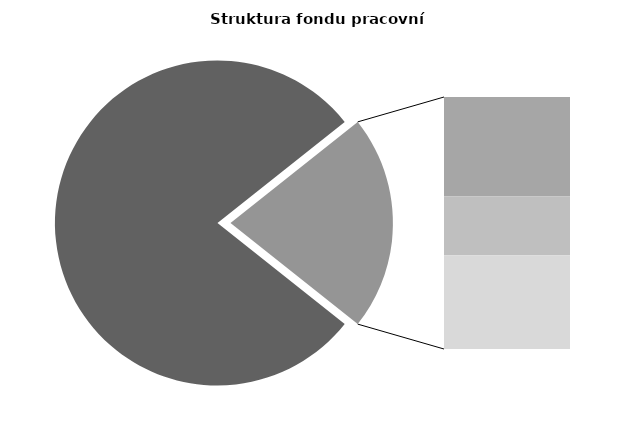
| Category | Series 0 |
|---|---|
| Průměrná měsíční odpracovaná doba bez přesčasu | 133.113 |
| Dovolená | 14.249 |
| Nemoc | 8.468 |
| Jiné | 13.478 |